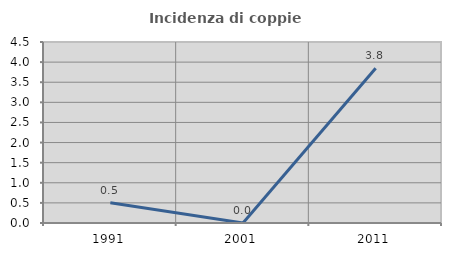
| Category | Incidenza di coppie miste |
|---|---|
| 1991.0 | 0.505 |
| 2001.0 | 0 |
| 2011.0 | 3.846 |